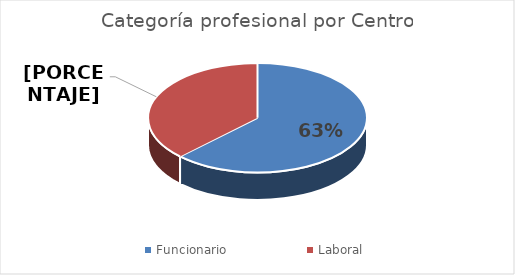
| Category | Series 0 |
|---|---|
| Funcionario | 55 |
| Laboral | 33 |